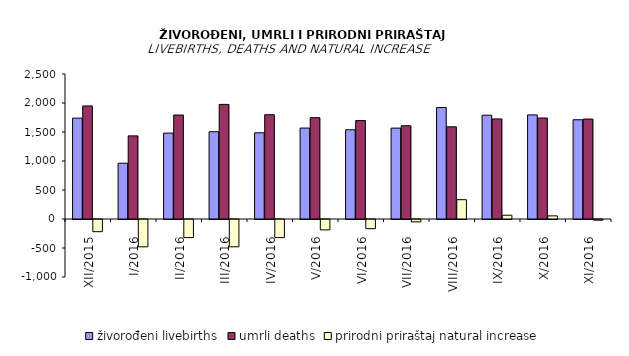
| Category | živorođeni livebirths | umrli deaths | prirodni priraštaj natural increase |
|---|---|---|---|
| XII/2015 | 1739 | 1949 | -210 |
| I/2016 | 962 | 1433 | -471 |
| II/2016 | 1481 | 1793 | -312 |
| III/2016 | 1505 | 1976 | -471 |
| IV/2016 | 1486 | 1798 | -312 |
| V/2016 | 1568 | 1747 | -179 |
| VI/2016 | 1539 | 1697 | -158 |
| VII/2016 | 1567 | 1608 | -41 |
| VIII/2016 | 1922 | 1589 | 333 |
| IX/2016 | 1790 | 1725 | 65 |
| X/2016 | 1795 | 1741 | 54 |
| XI/2016 | 1711 | 1723 | -12 |